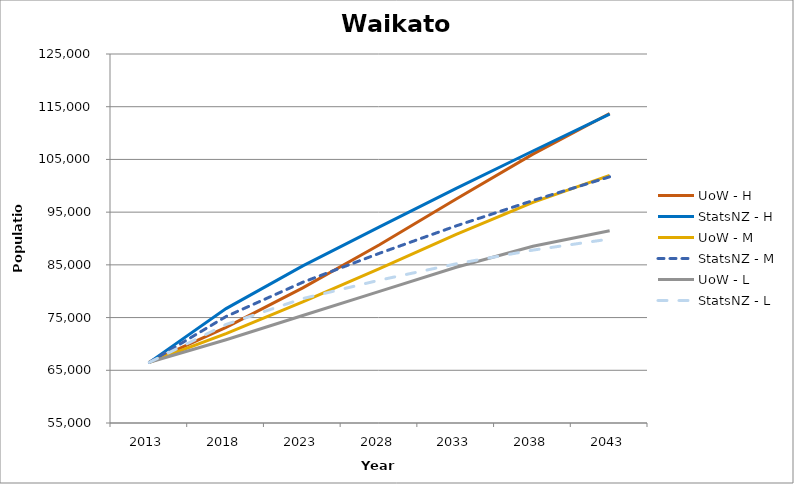
| Category | UoW - H | StatsNZ - H | UoW - M | StatsNZ - M | UoW - L | StatsNZ - L |
|---|---|---|---|---|---|---|
| 2013.0 | 66530 | 66500 | 66530 | 66500 | 66530 | 66500 |
| 2018.0 | 73130.164 | 76700 | 71954.351 | 75200 | 70798.594 | 73700 |
| 2023.0 | 80625.266 | 84800 | 77962.456 | 81700 | 75394.75 | 78600 |
| 2028.0 | 88806.664 | 92200 | 84270.987 | 87200 | 79981.57 | 82100 |
| 2033.0 | 97489.406 | 99500 | 90770.351 | 92400 | 84537.094 | 85200 |
| 2038.0 | 105998.125 | 106600 | 96859.446 | 97200 | 88537.758 | 87800 |
| 2043.0 | 113711.047 | 113600 | 101980.218 | 101700 | 91488.016 | 89900 |